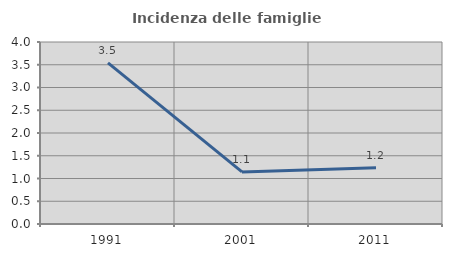
| Category | Incidenza delle famiglie numerose |
|---|---|
| 1991.0 | 3.541 |
| 2001.0 | 1.145 |
| 2011.0 | 1.235 |